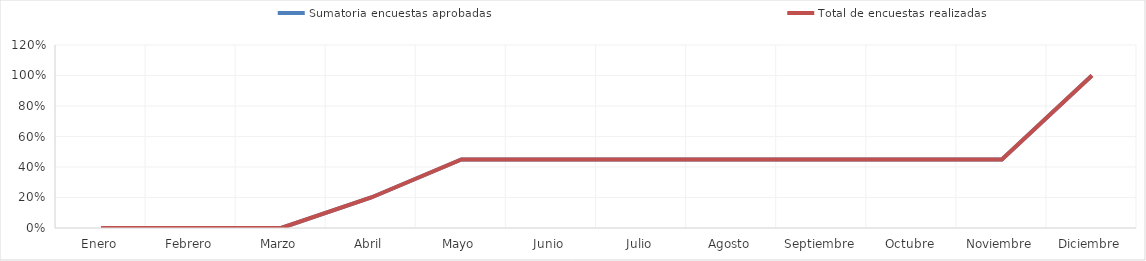
| Category | Sumatoria encuestas aprobadas | Total de encuestas realizadas |
|---|---|---|
| 0 | 0 | 0 |
| 1 | 0 | 0 |
| 2 | 0 | 0 |
| 3 | 0.2 | 0.2 |
| 4 | 0.45 | 0.45 |
| 5 | 0.45 | 0.45 |
| 6 | 0.45 | 0.45 |
| 7 | 0.45 | 0.45 |
| 8 | 0.45 | 0.45 |
| 9 | 0.45 | 0.45 |
| 10 | 0.45 | 0.45 |
| 11 | 1 | 1 |